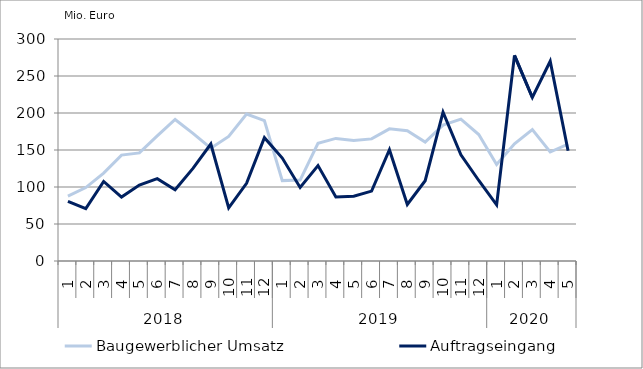
| Category | Baugewerblicher Umsatz | Auftragseingang |
|---|---|---|
| 0 | 87640.529 | 80684.627 |
| 1 | 99259.455 | 70746.763 |
| 2 | 118764.324 | 107538.747 |
| 3 | 143144.178 | 86374.619 |
| 4 | 146070.782 | 102661.329 |
| 5 | 169150.753 | 111287.709 |
| 6 | 191277.885 | 96286.662 |
| 7 | 172425.535 | 125142.495 |
| 8 | 152354.98 | 158112.302 |
| 9 | 168372.756 | 71808.619 |
| 10 | 198558.472 | 104904.147 |
| 11 | 189665.914 | 166653.461 |
| 12 | 108616.605 | 139065.287 |
| 13 | 109331.58 | 99318.609 |
| 14 | 159117.81 | 129002.041 |
| 15 | 165654.287 | 86579.2 |
| 16 | 162976.056 | 87644.362 |
| 17 | 165026.188 | 94463.186 |
| 18 | 178622.938 | 150345.08 |
| 19 | 176074.101 | 76434.317 |
| 20 | 160663.041 | 108444.162 |
| 21 | 183589.485 | 201122.697 |
| 22 | 191777.213 | 143514.792 |
| 23 | 170885.223 | 108780.022 |
| 24 | 130445.562 | 75891.481 |
| 25 | 158433.655 | 277923.85 |
| 26 | 177529.832 | 220973.626 |
| 27 | 147259.799 | 269936.091 |
| 28 | 157965.891 | 149072.895 |